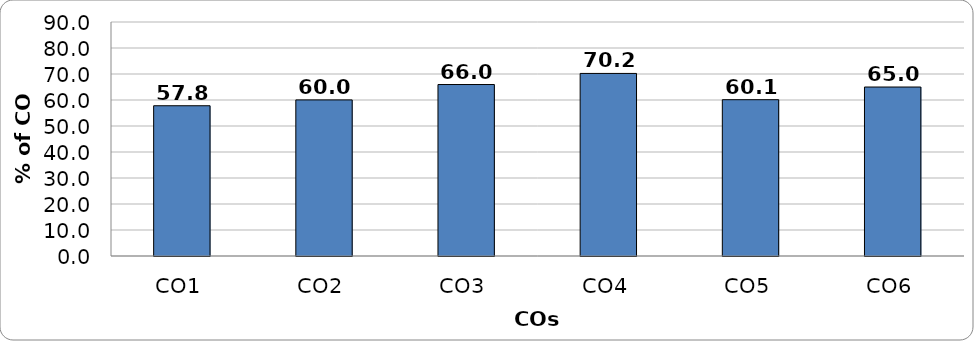
| Category | Series 0 |
|---|---|
| CO1 | 57.79 |
| CO2 | 60.04 |
| CO3 | 65.95 |
| CO4 | 70.22 |
| CO5 | 60.12 |
| CO6 | 64.99 |